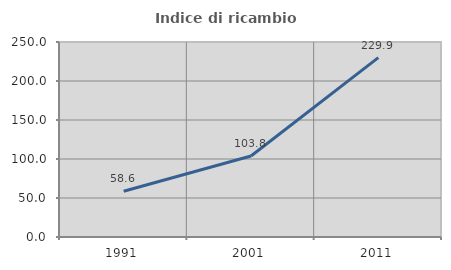
| Category | Indice di ricambio occupazionale  |
|---|---|
| 1991.0 | 58.568 |
| 2001.0 | 103.808 |
| 2011.0 | 229.925 |